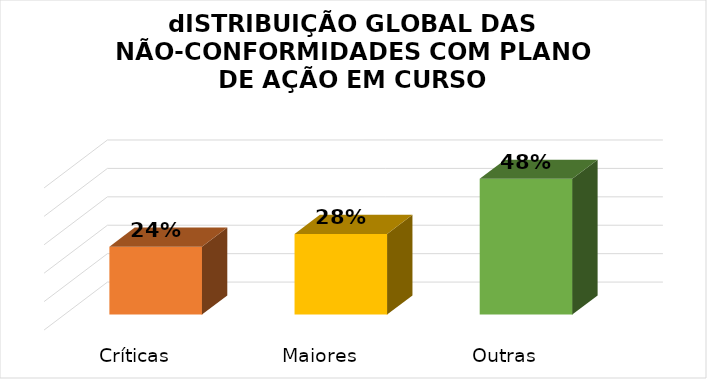
| Category | Series 0 |
|---|---|
| Críticas | 0.239 |
| Maiores | 0.284 |
| Outras | 0.478 |